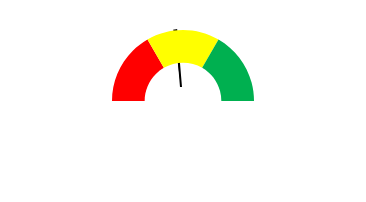
| Category | Series 1 |
|---|---|
| 0 | 30 |
| 1 | 1 |
| 2 | 100 |